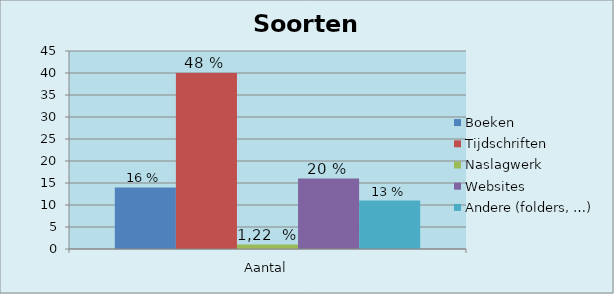
| Category | Boeken | Tijdschriften | Naslagwerk | Websites | Andere (folders, …) |
|---|---|---|---|---|---|
| Aantal | 14 | 40 | 1 | 16 | 11 |